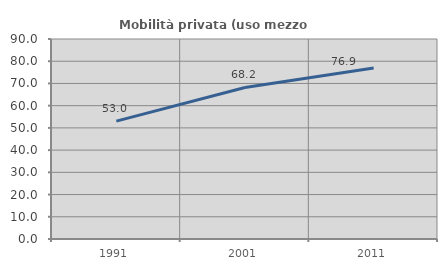
| Category | Mobilità privata (uso mezzo privato) |
|---|---|
| 1991.0 | 53.042 |
| 2001.0 | 68.193 |
| 2011.0 | 76.948 |